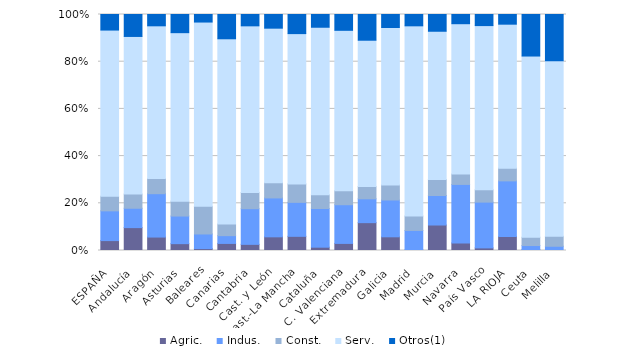
| Category | Agric. | Indus. | Const. | Serv. | Otros(1) |
|---|---|---|---|---|---|
| ESPAÑA | 4.2 | 12.6 | 6.2 | 70.4 | 6.6 |
| Andalucía | 9.7 | 8.2 | 6 | 66.8 | 9.3 |
| Aragón | 5.7 | 18.4 | 6.4 | 64.8 | 4.8 |
| Asturias | 2.9 | 11.7 | 6.3 | 71.4 | 7.7 |
| Baleares | 0.8 | 6.2 | 11.7 | 78.1 | 3.2 |
| Canarias | 3 | 3.3 | 4.9 | 78.6 | 10.3 |
| Cantabria | 2.6 | 15.1 | 6.9 | 70.5 | 4.8 |
| Cast. y León | 5.8 | 16.5 | 6.4 | 65.6 | 5.8 |
| Cast.-La Mancha | 6 | 14.4 | 7.8 | 63.7 | 8.1 |
| Cataluña | 1.4 | 16.4 | 5.8 | 71 | 5.4 |
| C. Valenciana | 3 | 16.4 | 5.9 | 68 | 6.7 |
| Extremadura | 11.8 | 10.1 | 5.2 | 62 | 10.9 |
| Galicia | 5.8 | 15.6 | 6.4 | 66.7 | 5.5 |
| Madrid | 0.2 | 8.3 | 6.1 | 80.6 | 4.8 |
| Murcia | 10.8 | 12.5 | 6.8 | 62.8 | 7.1 |
| Navarra | 3.2 | 24.8 | 4.4 | 63.7 | 3.9 |
| País Vasco | 1.1 | 19.4 | 5.2 | 69.6 | 4.7 |
| LA RIOJA | 5.9 | 23.6 | 5.4 | 61 | 4.1 |
| Ceuta | 0.3 | 1.8 | 3.5 | 76.8 | 17.6 |
| Melilla | 0 | 1.8 | 4.2 | 74.4 | 19.6 |